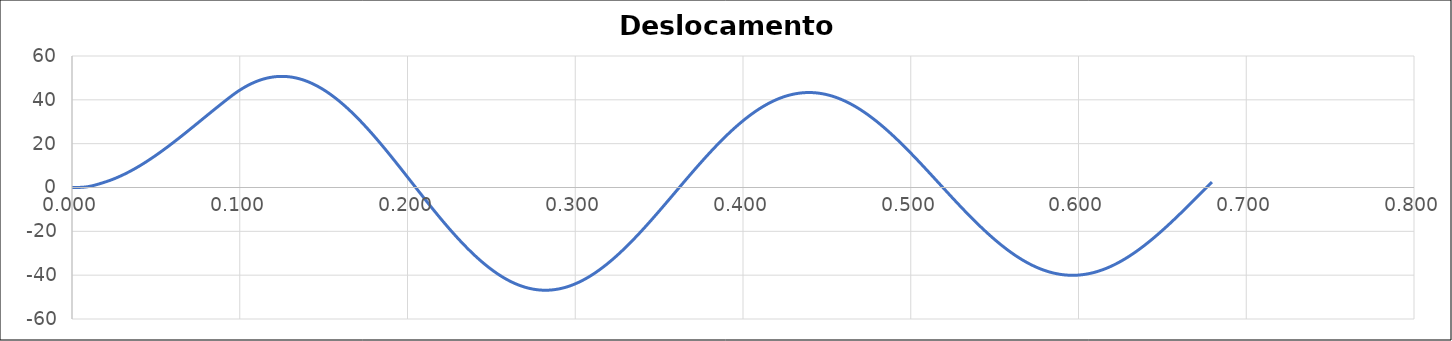
| Category | x em mm |
|---|---|
| 0.0 | 0 |
| 0.00031 | 0 |
| 0.00062 | 0 |
| 0.00093 | 0 |
| 0.00124 | 0.001 |
| 0.00155 | 0.002 |
| 0.0018599999999999999 | 0.003 |
| 0.00217 | 0.005 |
| 0.00248 | 0.007 |
| 0.00279 | 0.01 |
| 0.0031 | 0.013 |
| 0.00341 | 0.018 |
| 0.0037199999999999998 | 0.023 |
| 0.00403 | 0.03 |
| 0.00434 | 0.037 |
| 0.0046500000000000005 | 0.046 |
| 0.004960000000000001 | 0.055 |
| 0.005270000000000001 | 0.066 |
| 0.005580000000000002 | 0.079 |
| 0.005890000000000002 | 0.093 |
| 0.006200000000000002 | 0.108 |
| 0.006510000000000003 | 0.125 |
| 0.006820000000000003 | 0.144 |
| 0.0071300000000000035 | 0.165 |
| 0.007440000000000004 | 0.187 |
| 0.007750000000000004 | 0.212 |
| 0.008060000000000005 | 0.238 |
| 0.008370000000000004 | 0.267 |
| 0.008680000000000004 | 0.297 |
| 0.008990000000000003 | 0.33 |
| 0.009300000000000003 | 0.366 |
| 0.009610000000000002 | 0.403 |
| 0.009920000000000002 | 0.443 |
| 0.010230000000000001 | 0.486 |
| 0.01054 | 0.531 |
| 0.01085 | 0.578 |
| 0.01116 | 0.627 |
| 0.01147 | 0.678 |
| 0.011779999999999999 | 0.731 |
| 0.012089999999999998 | 0.786 |
| 0.012399999999999998 | 0.842 |
| 0.012709999999999997 | 0.901 |
| 0.013019999999999997 | 0.961 |
| 0.013329999999999996 | 1.022 |
| 0.013639999999999996 | 1.085 |
| 0.013949999999999995 | 1.149 |
| 0.014259999999999995 | 1.214 |
| 0.014569999999999994 | 1.281 |
| 0.014879999999999994 | 1.349 |
| 0.015189999999999993 | 1.417 |
| 0.015499999999999993 | 1.487 |
| 0.015809999999999994 | 1.558 |
| 0.016119999999999995 | 1.629 |
| 0.016429999999999997 | 1.701 |
| 0.016739999999999998 | 1.773 |
| 0.01705 | 1.846 |
| 0.01736 | 1.919 |
| 0.01767 | 1.993 |
| 0.017980000000000003 | 2.067 |
| 0.018290000000000004 | 2.141 |
| 0.018600000000000005 | 2.215 |
| 0.018910000000000007 | 2.289 |
| 0.019220000000000008 | 2.363 |
| 0.01953000000000001 | 2.438 |
| 0.01984000000000001 | 2.515 |
| 0.02015000000000001 | 2.592 |
| 0.020460000000000013 | 2.671 |
| 0.020770000000000014 | 2.75 |
| 0.021080000000000015 | 2.831 |
| 0.021390000000000017 | 2.913 |
| 0.021700000000000018 | 2.996 |
| 0.02201000000000002 | 3.08 |
| 0.02232000000000002 | 3.165 |
| 0.02263000000000002 | 3.252 |
| 0.022940000000000023 | 3.339 |
| 0.023250000000000024 | 3.428 |
| 0.023560000000000025 | 3.517 |
| 0.023870000000000027 | 3.608 |
| 0.024180000000000028 | 3.7 |
| 0.02449000000000003 | 3.793 |
| 0.02480000000000003 | 3.887 |
| 0.02511000000000003 | 3.982 |
| 0.025420000000000033 | 4.078 |
| 0.025730000000000034 | 4.175 |
| 0.026040000000000035 | 4.273 |
| 0.026350000000000037 | 4.372 |
| 0.026660000000000038 | 4.472 |
| 0.02697000000000004 | 4.574 |
| 0.02728000000000004 | 4.676 |
| 0.02759000000000004 | 4.78 |
| 0.027900000000000043 | 4.884 |
| 0.028210000000000044 | 4.989 |
| 0.028520000000000045 | 5.096 |
| 0.028830000000000047 | 5.203 |
| 0.029140000000000048 | 5.312 |
| 0.02945000000000005 | 5.422 |
| 0.02976000000000005 | 5.532 |
| 0.03007000000000005 | 5.644 |
| 0.030380000000000053 | 5.756 |
| 0.030690000000000054 | 5.87 |
| 0.031000000000000055 | 5.984 |
| 0.03131000000000005 | 6.1 |
| 0.03162000000000005 | 6.216 |
| 0.03193000000000005 | 6.334 |
| 0.032240000000000046 | 6.452 |
| 0.032550000000000044 | 6.572 |
| 0.03286000000000004 | 6.692 |
| 0.03317000000000004 | 6.813 |
| 0.03348000000000004 | 6.935 |
| 0.033790000000000035 | 7.059 |
| 0.03410000000000003 | 7.183 |
| 0.03441000000000003 | 7.308 |
| 0.03472000000000003 | 7.434 |
| 0.035030000000000026 | 7.561 |
| 0.035340000000000024 | 7.689 |
| 0.03565000000000002 | 7.817 |
| 0.03596000000000002 | 7.947 |
| 0.03627000000000002 | 8.078 |
| 0.036580000000000015 | 8.209 |
| 0.03689000000000001 | 8.341 |
| 0.03720000000000001 | 8.475 |
| 0.03751000000000001 | 8.609 |
| 0.037820000000000006 | 8.744 |
| 0.038130000000000004 | 8.88 |
| 0.03844 | 9.016 |
| 0.03875 | 9.154 |
| 0.03906 | 9.292 |
| 0.039369999999999995 | 9.432 |
| 0.03967999999999999 | 9.572 |
| 0.03998999999999999 | 9.713 |
| 0.04029999999999999 | 9.855 |
| 0.040609999999999986 | 9.997 |
| 0.040919999999999984 | 10.141 |
| 0.04122999999999998 | 10.285 |
| 0.04153999999999998 | 10.43 |
| 0.04184999999999998 | 10.576 |
| 0.042159999999999975 | 10.723 |
| 0.04246999999999997 | 10.87 |
| 0.04277999999999997 | 11.018 |
| 0.04308999999999997 | 11.167 |
| 0.043399999999999966 | 11.317 |
| 0.043709999999999964 | 11.468 |
| 0.04401999999999996 | 11.619 |
| 0.04432999999999996 | 11.771 |
| 0.04463999999999996 | 11.924 |
| 0.044949999999999955 | 12.078 |
| 0.04525999999999995 | 12.232 |
| 0.04556999999999995 | 12.387 |
| 0.04587999999999995 | 12.543 |
| 0.046189999999999946 | 12.699 |
| 0.046499999999999944 | 12.856 |
| 0.04680999999999994 | 13.014 |
| 0.04711999999999994 | 13.173 |
| 0.04742999999999994 | 13.332 |
| 0.047739999999999935 | 13.492 |
| 0.04804999999999993 | 13.653 |
| 0.04835999999999993 | 13.814 |
| 0.04866999999999993 | 13.976 |
| 0.048979999999999926 | 14.139 |
| 0.049289999999999924 | 14.302 |
| 0.04959999999999992 | 14.466 |
| 0.04990999999999992 | 14.631 |
| 0.05021999999999992 | 14.796 |
| 0.050529999999999915 | 14.962 |
| 0.05083999999999991 | 15.128 |
| 0.05114999999999991 | 15.295 |
| 0.05145999999999991 | 15.463 |
| 0.051769999999999906 | 15.632 |
| 0.052079999999999904 | 15.8 |
| 0.0523899999999999 | 15.97 |
| 0.0526999999999999 | 16.14 |
| 0.0530099999999999 | 16.311 |
| 0.053319999999999895 | 16.482 |
| 0.05362999999999989 | 16.654 |
| 0.05393999999999989 | 16.826 |
| 0.05424999999999989 | 16.999 |
| 0.054559999999999886 | 17.172 |
| 0.054869999999999884 | 17.346 |
| 0.05517999999999988 | 17.521 |
| 0.05548999999999988 | 17.696 |
| 0.05579999999999988 | 17.871 |
| 0.056109999999999875 | 18.048 |
| 0.05641999999999987 | 18.224 |
| 0.05672999999999987 | 18.401 |
| 0.05703999999999987 | 18.579 |
| 0.057349999999999866 | 18.757 |
| 0.057659999999999864 | 18.935 |
| 0.05796999999999986 | 19.114 |
| 0.05827999999999986 | 19.293 |
| 0.05858999999999986 | 19.473 |
| 0.058899999999999855 | 19.654 |
| 0.05920999999999985 | 19.834 |
| 0.05951999999999985 | 20.015 |
| 0.05982999999999985 | 20.197 |
| 0.060139999999999846 | 20.379 |
| 0.060449999999999844 | 20.561 |
| 0.06075999999999984 | 20.744 |
| 0.06106999999999984 | 20.927 |
| 0.06137999999999984 | 21.111 |
| 0.061689999999999835 | 21.295 |
| 0.06199999999999983 | 21.479 |
| 0.06230999999999983 | 21.664 |
| 0.06261999999999983 | 21.849 |
| 0.06292999999999983 | 22.035 |
| 0.06323999999999984 | 22.22 |
| 0.06354999999999984 | 22.406 |
| 0.06385999999999985 | 22.593 |
| 0.06416999999999985 | 22.78 |
| 0.06447999999999986 | 22.967 |
| 0.06478999999999986 | 23.154 |
| 0.06509999999999987 | 23.342 |
| 0.06540999999999987 | 23.53 |
| 0.06571999999999988 | 23.718 |
| 0.06602999999999988 | 23.907 |
| 0.06633999999999989 | 24.095 |
| 0.06664999999999989 | 24.284 |
| 0.0669599999999999 | 24.474 |
| 0.0672699999999999 | 24.663 |
| 0.0675799999999999 | 24.853 |
| 0.06788999999999991 | 25.043 |
| 0.06819999999999991 | 25.234 |
| 0.06850999999999992 | 25.424 |
| 0.06881999999999992 | 25.615 |
| 0.06912999999999993 | 25.806 |
| 0.06943999999999993 | 25.997 |
| 0.06974999999999994 | 26.188 |
| 0.07005999999999994 | 26.38 |
| 0.07036999999999995 | 26.571 |
| 0.07067999999999995 | 26.763 |
| 0.07098999999999996 | 26.955 |
| 0.07129999999999996 | 27.147 |
| 0.07160999999999997 | 27.339 |
| 0.07191999999999997 | 27.532 |
| 0.07222999999999997 | 27.724 |
| 0.07253999999999998 | 27.917 |
| 0.07284999999999998 | 28.11 |
| 0.07315999999999999 | 28.303 |
| 0.07347 | 28.496 |
| 0.07378 | 28.689 |
| 0.07409 | 28.882 |
| 0.07440000000000001 | 29.075 |
| 0.07471000000000001 | 29.269 |
| 0.07502000000000002 | 29.462 |
| 0.07533000000000002 | 29.656 |
| 0.07564000000000003 | 29.849 |
| 0.07595000000000003 | 30.043 |
| 0.07626000000000004 | 30.236 |
| 0.07657000000000004 | 30.43 |
| 0.07688000000000005 | 30.623 |
| 0.07719000000000005 | 30.817 |
| 0.07750000000000005 | 31.011 |
| 0.07781000000000006 | 31.204 |
| 0.07812000000000006 | 31.398 |
| 0.07843000000000007 | 31.592 |
| 0.07874000000000007 | 31.785 |
| 0.07905000000000008 | 31.979 |
| 0.07936000000000008 | 32.172 |
| 0.07967000000000009 | 32.366 |
| 0.07998000000000009 | 32.559 |
| 0.0802900000000001 | 32.752 |
| 0.0806000000000001 | 32.946 |
| 0.0809100000000001 | 33.139 |
| 0.08122000000000011 | 33.332 |
| 0.08153000000000012 | 33.525 |
| 0.08184000000000012 | 33.718 |
| 0.08215000000000013 | 33.911 |
| 0.08246000000000013 | 34.103 |
| 0.08277000000000014 | 34.296 |
| 0.08308000000000014 | 34.488 |
| 0.08339000000000014 | 34.681 |
| 0.08370000000000015 | 34.873 |
| 0.08401000000000015 | 35.065 |
| 0.08432000000000016 | 35.257 |
| 0.08463000000000016 | 35.448 |
| 0.08494000000000017 | 35.64 |
| 0.08525000000000017 | 35.831 |
| 0.08556000000000018 | 36.022 |
| 0.08587000000000018 | 36.213 |
| 0.08618000000000019 | 36.404 |
| 0.08649000000000019 | 36.595 |
| 0.0868000000000002 | 36.785 |
| 0.0871100000000002 | 36.975 |
| 0.0874200000000002 | 37.165 |
| 0.08773000000000021 | 37.355 |
| 0.08804000000000022 | 37.544 |
| 0.08835000000000022 | 37.733 |
| 0.08866000000000022 | 37.922 |
| 0.08897000000000023 | 38.11 |
| 0.08928000000000023 | 38.299 |
| 0.08959000000000024 | 38.487 |
| 0.08990000000000024 | 38.675 |
| 0.09021000000000025 | 38.862 |
| 0.09052000000000025 | 39.049 |
| 0.09083000000000026 | 39.236 |
| 0.09114000000000026 | 39.423 |
| 0.09145000000000027 | 39.609 |
| 0.09176000000000027 | 39.795 |
| 0.09207000000000028 | 39.98 |
| 0.09238000000000028 | 40.165 |
| 0.09269000000000029 | 40.35 |
| 0.09300000000000029 | 40.535 |
| 0.0933100000000003 | 40.719 |
| 0.0936200000000003 | 40.902 |
| 0.0939300000000003 | 41.086 |
| 0.09424000000000031 | 41.269 |
| 0.09455000000000031 | 41.451 |
| 0.09486000000000032 | 41.633 |
| 0.09517000000000032 | 41.814 |
| 0.09548000000000033 | 41.993 |
| 0.09579000000000033 | 42.17 |
| 0.09610000000000034 | 42.346 |
| 0.09641000000000034 | 42.519 |
| 0.09672000000000035 | 42.691 |
| 0.09703000000000035 | 42.862 |
| 0.09734000000000036 | 43.031 |
| 0.09765000000000036 | 43.198 |
| 0.09796000000000037 | 43.363 |
| 0.09827000000000037 | 43.527 |
| 0.09858000000000038 | 43.688 |
| 0.09889000000000038 | 43.849 |
| 0.09920000000000039 | 44.007 |
| 0.09951000000000039 | 44.164 |
| 0.0998200000000004 | 44.319 |
| 0.1001300000000004 | 44.472 |
| 0.1004400000000004 | 44.623 |
| 0.10075000000000041 | 44.773 |
| 0.10106000000000041 | 44.921 |
| 0.10137000000000042 | 45.067 |
| 0.10168000000000042 | 45.211 |
| 0.10199000000000043 | 45.354 |
| 0.10230000000000043 | 45.495 |
| 0.10261000000000044 | 45.634 |
| 0.10292000000000044 | 45.771 |
| 0.10323000000000045 | 45.906 |
| 0.10354000000000045 | 46.04 |
| 0.10385000000000046 | 46.171 |
| 0.10416000000000046 | 46.301 |
| 0.10447000000000047 | 46.43 |
| 0.10478000000000047 | 46.556 |
| 0.10509000000000047 | 46.68 |
| 0.10540000000000048 | 46.803 |
| 0.10571000000000048 | 46.924 |
| 0.10602000000000049 | 47.043 |
| 0.1063300000000005 | 47.16 |
| 0.1066400000000005 | 47.275 |
| 0.1069500000000005 | 47.388 |
| 0.10726000000000051 | 47.5 |
| 0.10757000000000051 | 47.61 |
| 0.10788000000000052 | 47.718 |
| 0.10819000000000052 | 47.824 |
| 0.10850000000000053 | 47.928 |
| 0.10881000000000053 | 48.03 |
| 0.10912000000000054 | 48.13 |
| 0.10943000000000054 | 48.229 |
| 0.10974000000000055 | 48.325 |
| 0.11005000000000055 | 48.42 |
| 0.11036000000000055 | 48.513 |
| 0.11067000000000056 | 48.604 |
| 0.11098000000000056 | 48.693 |
| 0.11129000000000057 | 48.78 |
| 0.11160000000000057 | 48.865 |
| 0.11191000000000058 | 48.948 |
| 0.11222000000000058 | 49.03 |
| 0.11253000000000059 | 49.109 |
| 0.11284000000000059 | 49.187 |
| 0.1131500000000006 | 49.262 |
| 0.1134600000000006 | 49.336 |
| 0.1137700000000006 | 49.408 |
| 0.11408000000000061 | 49.478 |
| 0.11439000000000062 | 49.546 |
| 0.11470000000000062 | 49.612 |
| 0.11501000000000063 | 49.676 |
| 0.11532000000000063 | 49.738 |
| 0.11563000000000064 | 49.799 |
| 0.11594000000000064 | 49.857 |
| 0.11625000000000064 | 49.913 |
| 0.11656000000000065 | 49.968 |
| 0.11687000000000065 | 50.02 |
| 0.11718000000000066 | 50.071 |
| 0.11749000000000066 | 50.12 |
| 0.11780000000000067 | 50.166 |
| 0.11811000000000067 | 50.211 |
| 0.11842000000000068 | 50.254 |
| 0.11873000000000068 | 50.295 |
| 0.11904000000000069 | 50.334 |
| 0.11935000000000069 | 50.371 |
| 0.1196600000000007 | 50.406 |
| 0.1199700000000007 | 50.439 |
| 0.1202800000000007 | 50.47 |
| 0.12059000000000071 | 50.499 |
| 0.12090000000000072 | 50.526 |
| 0.12121000000000072 | 50.552 |
| 0.12152000000000072 | 50.575 |
| 0.12183000000000073 | 50.596 |
| 0.12214000000000073 | 50.616 |
| 0.12245000000000074 | 50.633 |
| 0.12276000000000074 | 50.649 |
| 0.12307000000000075 | 50.663 |
| 0.12338000000000075 | 50.674 |
| 0.12369000000000076 | 50.684 |
| 0.12400000000000076 | 50.692 |
| 0.12431000000000077 | 50.697 |
| 0.12462000000000077 | 50.701 |
| 0.12493000000000078 | 50.703 |
| 0.12524000000000077 | 50.703 |
| 0.12555000000000077 | 50.701 |
| 0.12586000000000078 | 50.697 |
| 0.12617000000000078 | 50.691 |
| 0.1264800000000008 | 50.683 |
| 0.1267900000000008 | 50.673 |
| 0.1271000000000008 | 50.662 |
| 0.1274100000000008 | 50.648 |
| 0.1277200000000008 | 50.632 |
| 0.1280300000000008 | 50.615 |
| 0.12834000000000081 | 50.595 |
| 0.12865000000000082 | 50.574 |
| 0.12896000000000082 | 50.55 |
| 0.12927000000000083 | 50.525 |
| 0.12958000000000083 | 50.498 |
| 0.12989000000000084 | 50.469 |
| 0.13020000000000084 | 50.438 |
| 0.13051000000000085 | 50.405 |
| 0.13082000000000085 | 50.37 |
| 0.13113000000000086 | 50.333 |
| 0.13144000000000086 | 50.294 |
| 0.13175000000000087 | 50.253 |
| 0.13206000000000087 | 50.21 |
| 0.13237000000000088 | 50.166 |
| 0.13268000000000088 | 50.119 |
| 0.13299000000000089 | 50.071 |
| 0.1333000000000009 | 50.021 |
| 0.1336100000000009 | 49.968 |
| 0.1339200000000009 | 49.914 |
| 0.1342300000000009 | 49.858 |
| 0.1345400000000009 | 49.8 |
| 0.1348500000000009 | 49.74 |
| 0.13516000000000092 | 49.679 |
| 0.13547000000000092 | 49.615 |
| 0.13578000000000093 | 49.55 |
| 0.13609000000000093 | 49.482 |
| 0.13640000000000094 | 49.413 |
| 0.13671000000000094 | 49.342 |
| 0.13702000000000095 | 49.269 |
| 0.13733000000000095 | 49.194 |
| 0.13764000000000096 | 49.117 |
| 0.13795000000000096 | 49.039 |
| 0.13826000000000097 | 48.958 |
| 0.13857000000000097 | 48.876 |
| 0.13888000000000097 | 48.792 |
| 0.13919000000000098 | 48.706 |
| 0.13950000000000098 | 48.618 |
| 0.139810000000001 | 48.528 |
| 0.140120000000001 | 48.436 |
| 0.140430000000001 | 48.343 |
| 0.140740000000001 | 48.248 |
| 0.141050000000001 | 48.151 |
| 0.141360000000001 | 48.052 |
| 0.14167000000000102 | 47.951 |
| 0.14198000000000102 | 47.849 |
| 0.14229000000000103 | 47.744 |
| 0.14260000000000103 | 47.638 |
| 0.14291000000000104 | 47.53 |
| 0.14322000000000104 | 47.421 |
| 0.14353000000000105 | 47.309 |
| 0.14384000000000105 | 47.196 |
| 0.14415000000000106 | 47.081 |
| 0.14446000000000106 | 46.964 |
| 0.14477000000000106 | 46.845 |
| 0.14508000000000107 | 46.725 |
| 0.14539000000000107 | 46.603 |
| 0.14570000000000108 | 46.479 |
| 0.14601000000000108 | 46.354 |
| 0.1463200000000011 | 46.226 |
| 0.1466300000000011 | 46.097 |
| 0.1469400000000011 | 45.966 |
| 0.1472500000000011 | 45.834 |
| 0.1475600000000011 | 45.699 |
| 0.1478700000000011 | 45.563 |
| 0.14818000000000112 | 45.426 |
| 0.14849000000000112 | 45.286 |
| 0.14880000000000113 | 45.145 |
| 0.14911000000000113 | 45.002 |
| 0.14942000000000114 | 44.858 |
| 0.14973000000000114 | 44.712 |
| 0.15004000000000114 | 44.564 |
| 0.15035000000000115 | 44.415 |
| 0.15066000000000115 | 44.263 |
| 0.15097000000000116 | 44.111 |
| 0.15128000000000116 | 43.956 |
| 0.15159000000000117 | 43.8 |
| 0.15190000000000117 | 43.642 |
| 0.15221000000000118 | 43.483 |
| 0.15252000000000118 | 43.322 |
| 0.1528300000000012 | 43.159 |
| 0.1531400000000012 | 42.995 |
| 0.1534500000000012 | 42.829 |
| 0.1537600000000012 | 42.662 |
| 0.1540700000000012 | 42.493 |
| 0.1543800000000012 | 42.322 |
| 0.15469000000000122 | 42.15 |
| 0.15500000000000122 | 41.977 |
| 0.15531000000000122 | 41.801 |
| 0.15562000000000123 | 41.624 |
| 0.15593000000000123 | 41.446 |
| 0.15624000000000124 | 41.266 |
| 0.15655000000000124 | 41.085 |
| 0.15686000000000125 | 40.902 |
| 0.15717000000000125 | 40.717 |
| 0.15748000000000126 | 40.531 |
| 0.15779000000000126 | 40.344 |
| 0.15810000000000127 | 40.155 |
| 0.15841000000000127 | 39.964 |
| 0.15872000000000128 | 39.772 |
| 0.15903000000000128 | 39.579 |
| 0.1593400000000013 | 39.384 |
| 0.1596500000000013 | 39.188 |
| 0.1599600000000013 | 38.99 |
| 0.1602700000000013 | 38.791 |
| 0.1605800000000013 | 38.59 |
| 0.1608900000000013 | 38.388 |
| 0.16120000000000131 | 38.185 |
| 0.16151000000000132 | 37.98 |
| 0.16182000000000132 | 37.774 |
| 0.16213000000000133 | 37.566 |
| 0.16244000000000133 | 37.357 |
| 0.16275000000000134 | 37.147 |
| 0.16306000000000134 | 36.935 |
| 0.16337000000000135 | 36.722 |
| 0.16368000000000135 | 36.507 |
| 0.16399000000000136 | 36.291 |
| 0.16430000000000136 | 36.074 |
| 0.16461000000000137 | 35.856 |
| 0.16492000000000137 | 35.636 |
| 0.16523000000000138 | 35.415 |
| 0.16554000000000138 | 35.193 |
| 0.16585000000000139 | 34.969 |
| 0.1661600000000014 | 34.744 |
| 0.1664700000000014 | 34.518 |
| 0.1667800000000014 | 34.291 |
| 0.1670900000000014 | 34.062 |
| 0.1674000000000014 | 33.832 |
| 0.1677100000000014 | 33.601 |
| 0.16802000000000142 | 33.368 |
| 0.16833000000000142 | 33.135 |
| 0.16864000000000143 | 32.9 |
| 0.16895000000000143 | 32.664 |
| 0.16926000000000144 | 32.427 |
| 0.16957000000000144 | 32.189 |
| 0.16988000000000145 | 31.949 |
| 0.17019000000000145 | 31.708 |
| 0.17050000000000146 | 31.467 |
| 0.17081000000000146 | 31.224 |
| 0.17112000000000147 | 30.98 |
| 0.17143000000000147 | 30.735 |
| 0.17174000000000147 | 30.488 |
| 0.17205000000000148 | 30.241 |
| 0.17236000000000148 | 29.992 |
| 0.1726700000000015 | 29.743 |
| 0.1729800000000015 | 29.492 |
| 0.1732900000000015 | 29.241 |
| 0.1736000000000015 | 28.988 |
| 0.1739100000000015 | 28.734 |
| 0.1742200000000015 | 28.48 |
| 0.17453000000000152 | 28.224 |
| 0.17484000000000152 | 27.967 |
| 0.17515000000000153 | 27.709 |
| 0.17546000000000153 | 27.45 |
| 0.17577000000000154 | 27.191 |
| 0.17608000000000154 | 26.93 |
| 0.17639000000000155 | 26.668 |
| 0.17670000000000155 | 26.406 |
| 0.17701000000000155 | 26.142 |
| 0.17732000000000156 | 25.878 |
| 0.17763000000000156 | 25.612 |
| 0.17794000000000157 | 25.346 |
| 0.17825000000000157 | 25.079 |
| 0.17856000000000158 | 24.811 |
| 0.17887000000000158 | 24.542 |
| 0.1791800000000016 | 24.272 |
| 0.1794900000000016 | 24.002 |
| 0.1798000000000016 | 23.73 |
| 0.1801100000000016 | 23.458 |
| 0.1804200000000016 | 23.185 |
| 0.1807300000000016 | 22.911 |
| 0.18104000000000162 | 22.636 |
| 0.18135000000000162 | 22.361 |
| 0.18166000000000163 | 22.085 |
| 0.18197000000000163 | 21.808 |
| 0.18228000000000164 | 21.53 |
| 0.18259000000000164 | 21.251 |
| 0.18290000000000164 | 20.972 |
| 0.18321000000000165 | 20.692 |
| 0.18352000000000165 | 20.411 |
| 0.18383000000000166 | 20.13 |
| 0.18414000000000166 | 19.848 |
| 0.18445000000000167 | 19.565 |
| 0.18476000000000167 | 19.282 |
| 0.18507000000000168 | 18.998 |
| 0.18538000000000168 | 18.713 |
| 0.1856900000000017 | 18.428 |
| 0.1860000000000017 | 18.142 |
| 0.1863100000000017 | 17.855 |
| 0.1866200000000017 | 17.568 |
| 0.1869300000000017 | 17.28 |
| 0.1872400000000017 | 16.992 |
| 0.18755000000000172 | 16.703 |
| 0.18786000000000172 | 16.414 |
| 0.18817000000000172 | 16.124 |
| 0.18848000000000173 | 15.833 |
| 0.18879000000000173 | 15.542 |
| 0.18910000000000174 | 15.251 |
| 0.18941000000000174 | 14.959 |
| 0.18972000000000175 | 14.666 |
| 0.19003000000000175 | 14.373 |
| 0.19034000000000176 | 14.08 |
| 0.19065000000000176 | 13.786 |
| 0.19096000000000177 | 13.492 |
| 0.19127000000000177 | 13.197 |
| 0.19158000000000178 | 12.902 |
| 0.19189000000000178 | 12.606 |
| 0.19220000000000179 | 12.31 |
| 0.1925100000000018 | 12.014 |
| 0.1928200000000018 | 11.717 |
| 0.1931300000000018 | 11.42 |
| 0.1934400000000018 | 11.122 |
| 0.1937500000000018 | 10.825 |
| 0.19406000000000181 | 10.527 |
| 0.19437000000000182 | 10.228 |
| 0.19468000000000182 | 9.93 |
| 0.19499000000000183 | 9.631 |
| 0.19530000000000183 | 9.331 |
| 0.19561000000000184 | 9.032 |
| 0.19592000000000184 | 8.732 |
| 0.19623000000000185 | 8.432 |
| 0.19654000000000185 | 8.132 |
| 0.19685000000000186 | 7.831 |
| 0.19716000000000186 | 7.531 |
| 0.19747000000000187 | 7.23 |
| 0.19778000000000187 | 6.929 |
| 0.19809000000000188 | 6.627 |
| 0.19840000000000188 | 6.326 |
| 0.19871000000000189 | 6.024 |
| 0.1990200000000019 | 5.723 |
| 0.1993300000000019 | 5.421 |
| 0.1996400000000019 | 5.119 |
| 0.1999500000000019 | 4.817 |
| 0.2002600000000019 | 4.515 |
| 0.2005700000000019 | 4.213 |
| 0.20088000000000192 | 3.91 |
| 0.20119000000000192 | 3.608 |
| 0.20150000000000193 | 3.306 |
| 0.20181000000000193 | 3.003 |
| 0.20212000000000194 | 2.701 |
| 0.20243000000000194 | 2.398 |
| 0.20274000000000195 | 2.096 |
| 0.20305000000000195 | 1.793 |
| 0.20336000000000196 | 1.491 |
| 0.20367000000000196 | 1.189 |
| 0.20398000000000197 | 0.886 |
| 0.20429000000000197 | 0.584 |
| 0.20460000000000197 | 0.282 |
| 0.20491000000000198 | -0.02 |
| 0.20522000000000198 | -0.322 |
| 0.205530000000002 | -0.624 |
| 0.205840000000002 | -0.926 |
| 0.206150000000002 | -1.227 |
| 0.206460000000002 | -1.529 |
| 0.206770000000002 | -1.83 |
| 0.207080000000002 | -2.132 |
| 0.20739000000000202 | -2.433 |
| 0.20770000000000202 | -2.733 |
| 0.20801000000000203 | -3.034 |
| 0.20832000000000203 | -3.334 |
| 0.20863000000000204 | -3.635 |
| 0.20894000000000204 | -3.935 |
| 0.20925000000000205 | -4.234 |
| 0.20956000000000205 | -4.534 |
| 0.20987000000000205 | -4.833 |
| 0.21018000000000206 | -5.132 |
| 0.21049000000000206 | -5.431 |
| 0.21080000000000207 | -5.729 |
| 0.21111000000000207 | -6.027 |
| 0.21142000000000208 | -6.325 |
| 0.21173000000000208 | -6.622 |
| 0.2120400000000021 | -6.919 |
| 0.2123500000000021 | -7.216 |
| 0.2126600000000021 | -7.512 |
| 0.2129700000000021 | -7.808 |
| 0.2132800000000021 | -8.103 |
| 0.2135900000000021 | -8.399 |
| 0.21390000000000212 | -8.693 |
| 0.21421000000000212 | -8.988 |
| 0.21452000000000213 | -9.281 |
| 0.21483000000000213 | -9.575 |
| 0.21514000000000214 | -9.868 |
| 0.21545000000000214 | -10.16 |
| 0.21576000000000214 | -10.452 |
| 0.21607000000000215 | -10.744 |
| 0.21638000000000215 | -11.035 |
| 0.21669000000000216 | -11.325 |
| 0.21700000000000216 | -11.615 |
| 0.21731000000000217 | -11.904 |
| 0.21762000000000217 | -12.193 |
| 0.21793000000000218 | -12.482 |
| 0.21824000000000218 | -12.769 |
| 0.2185500000000022 | -13.056 |
| 0.2188600000000022 | -13.343 |
| 0.2191700000000022 | -13.629 |
| 0.2194800000000022 | -13.914 |
| 0.2197900000000022 | -14.199 |
| 0.2201000000000022 | -14.483 |
| 0.22041000000000222 | -14.767 |
| 0.22072000000000222 | -15.049 |
| 0.22103000000000222 | -15.332 |
| 0.22134000000000223 | -15.613 |
| 0.22165000000000223 | -15.894 |
| 0.22196000000000224 | -16.174 |
| 0.22227000000000224 | -16.453 |
| 0.22258000000000225 | -16.732 |
| 0.22289000000000225 | -17.01 |
| 0.22320000000000226 | -17.287 |
| 0.22351000000000226 | -17.563 |
| 0.22382000000000227 | -17.839 |
| 0.22413000000000227 | -18.114 |
| 0.22444000000000228 | -18.388 |
| 0.22475000000000228 | -18.661 |
| 0.22506000000000229 | -18.934 |
| 0.2253700000000023 | -19.205 |
| 0.2256800000000023 | -19.476 |
| 0.2259900000000023 | -19.746 |
| 0.2263000000000023 | -20.016 |
| 0.2266100000000023 | -20.284 |
| 0.22692000000000231 | -20.551 |
| 0.22723000000000232 | -20.818 |
| 0.22754000000000232 | -21.084 |
| 0.22785000000000233 | -21.349 |
| 0.22816000000000233 | -21.613 |
| 0.22847000000000234 | -21.876 |
| 0.22878000000000234 | -22.138 |
| 0.22909000000000235 | -22.399 |
| 0.22940000000000235 | -22.659 |
| 0.22971000000000236 | -22.918 |
| 0.23002000000000236 | -23.177 |
| 0.23033000000000237 | -23.434 |
| 0.23064000000000237 | -23.69 |
| 0.23095000000000238 | -23.946 |
| 0.23126000000000238 | -24.2 |
| 0.23157000000000239 | -24.453 |
| 0.2318800000000024 | -24.706 |
| 0.2321900000000024 | -24.957 |
| 0.2325000000000024 | -25.207 |
| 0.2328100000000024 | -25.457 |
| 0.2331200000000024 | -25.705 |
| 0.2334300000000024 | -25.952 |
| 0.23374000000000242 | -26.198 |
| 0.23405000000000242 | -26.443 |
| 0.23436000000000243 | -26.687 |
| 0.23467000000000243 | -26.93 |
| 0.23498000000000244 | -27.171 |
| 0.23529000000000244 | -27.412 |
| 0.23560000000000245 | -27.651 |
| 0.23591000000000245 | -27.889 |
| 0.23622000000000246 | -28.127 |
| 0.23653000000000246 | -28.363 |
| 0.23684000000000247 | -28.597 |
| 0.23715000000000247 | -28.831 |
| 0.23746000000000247 | -29.063 |
| 0.23777000000000248 | -29.295 |
| 0.23808000000000248 | -29.525 |
| 0.2383900000000025 | -29.754 |
| 0.2387000000000025 | -29.981 |
| 0.2390100000000025 | -30.208 |
| 0.2393200000000025 | -30.433 |
| 0.2396300000000025 | -30.657 |
| 0.2399400000000025 | -30.88 |
| 0.24025000000000252 | -31.101 |
| 0.24056000000000252 | -31.321 |
| 0.24087000000000253 | -31.54 |
| 0.24118000000000253 | -31.758 |
| 0.24149000000000254 | -31.974 |
| 0.24180000000000254 | -32.189 |
| 0.24211000000000255 | -32.403 |
| 0.24242000000000255 | -32.615 |
| 0.24273000000000255 | -32.826 |
| 0.24304000000000256 | -33.036 |
| 0.24335000000000256 | -33.245 |
| 0.24366000000000257 | -33.452 |
| 0.24397000000000257 | -33.658 |
| 0.24428000000000258 | -33.862 |
| 0.24459000000000258 | -34.065 |
| 0.2449000000000026 | -34.267 |
| 0.2452100000000026 | -34.467 |
| 0.2455200000000026 | -34.666 |
| 0.2458300000000026 | -34.863 |
| 0.2461400000000026 | -35.059 |
| 0.2464500000000026 | -35.254 |
| 0.24676000000000262 | -35.447 |
| 0.24707000000000262 | -35.639 |
| 0.24738000000000263 | -35.83 |
| 0.24769000000000263 | -36.019 |
| 0.24800000000000264 | -36.206 |
| 0.24831000000000264 | -36.392 |
| 0.24862000000000264 | -36.577 |
| 0.24893000000000265 | -36.76 |
| 0.24924000000000265 | -36.942 |
| 0.24955000000000266 | -37.122 |
| 0.24986000000000266 | -37.301 |
| 0.25017000000000267 | -37.478 |
| 0.25048000000000264 | -37.654 |
| 0.2507900000000026 | -37.828 |
| 0.2511000000000026 | -38.001 |
| 0.2514100000000026 | -38.172 |
| 0.25172000000000255 | -38.342 |
| 0.25203000000000253 | -38.51 |
| 0.2523400000000025 | -38.677 |
| 0.2526500000000025 | -38.842 |
| 0.25296000000000246 | -39.005 |
| 0.25327000000000244 | -39.167 |
| 0.2535800000000024 | -39.328 |
| 0.2538900000000024 | -39.487 |
| 0.25420000000000237 | -39.644 |
| 0.25451000000000235 | -39.8 |
| 0.2548200000000023 | -39.954 |
| 0.2551300000000023 | -40.107 |
| 0.2554400000000023 | -40.258 |
| 0.25575000000000225 | -40.407 |
| 0.25606000000000223 | -40.555 |
| 0.2563700000000022 | -40.701 |
| 0.2566800000000022 | -40.846 |
| 0.25699000000000216 | -40.989 |
| 0.25730000000000214 | -41.13 |
| 0.2576100000000021 | -41.27 |
| 0.2579200000000021 | -41.408 |
| 0.25823000000000207 | -41.545 |
| 0.25854000000000205 | -41.68 |
| 0.258850000000002 | -41.813 |
| 0.259160000000002 | -41.944 |
| 0.259470000000002 | -42.074 |
| 0.25978000000000195 | -42.203 |
| 0.26009000000000193 | -42.329 |
| 0.2604000000000019 | -42.454 |
| 0.2607100000000019 | -42.577 |
| 0.26102000000000186 | -42.699 |
| 0.26133000000000184 | -42.819 |
| 0.2616400000000018 | -42.937 |
| 0.2619500000000018 | -43.054 |
| 0.26226000000000177 | -43.168 |
| 0.26257000000000175 | -43.282 |
| 0.2628800000000017 | -43.393 |
| 0.2631900000000017 | -43.503 |
| 0.2635000000000017 | -43.611 |
| 0.26381000000000165 | -43.717 |
| 0.26412000000000163 | -43.822 |
| 0.2644300000000016 | -43.925 |
| 0.2647400000000016 | -44.026 |
| 0.26505000000000156 | -44.125 |
| 0.26536000000000154 | -44.223 |
| 0.2656700000000015 | -44.319 |
| 0.2659800000000015 | -44.413 |
| 0.26629000000000147 | -44.506 |
| 0.26660000000000145 | -44.597 |
| 0.2669100000000014 | -44.686 |
| 0.2672200000000014 | -44.773 |
| 0.2675300000000014 | -44.859 |
| 0.26784000000000135 | -44.942 |
| 0.26815000000000133 | -45.024 |
| 0.2684600000000013 | -45.105 |
| 0.2687700000000013 | -45.183 |
| 0.26908000000000126 | -45.26 |
| 0.26939000000000124 | -45.335 |
| 0.2697000000000012 | -45.408 |
| 0.2700100000000012 | -45.48 |
| 0.27032000000000117 | -45.549 |
| 0.27063000000000115 | -45.617 |
| 0.2709400000000011 | -45.684 |
| 0.2712500000000011 | -45.748 |
| 0.2715600000000011 | -45.811 |
| 0.27187000000000106 | -45.871 |
| 0.27218000000000103 | -45.93 |
| 0.272490000000001 | -45.988 |
| 0.272800000000001 | -46.043 |
| 0.27311000000000096 | -46.097 |
| 0.27342000000000094 | -46.149 |
| 0.2737300000000009 | -46.199 |
| 0.2740400000000009 | -46.247 |
| 0.27435000000000087 | -46.294 |
| 0.27466000000000085 | -46.339 |
| 0.2749700000000008 | -46.381 |
| 0.2752800000000008 | -46.423 |
| 0.2755900000000008 | -46.462 |
| 0.27590000000000076 | -46.5 |
| 0.27621000000000073 | -46.535 |
| 0.2765200000000007 | -46.569 |
| 0.2768300000000007 | -46.601 |
| 0.27714000000000066 | -46.632 |
| 0.27745000000000064 | -46.66 |
| 0.2777600000000006 | -46.687 |
| 0.2780700000000006 | -46.712 |
| 0.27838000000000057 | -46.735 |
| 0.27869000000000055 | -46.756 |
| 0.2790000000000005 | -46.776 |
| 0.2793100000000005 | -46.794 |
| 0.2796200000000005 | -46.81 |
| 0.27993000000000046 | -46.824 |
| 0.28024000000000043 | -46.836 |
| 0.2805500000000004 | -46.847 |
| 0.2808600000000004 | -46.855 |
| 0.28117000000000036 | -46.862 |
| 0.28148000000000034 | -46.867 |
| 0.2817900000000003 | -46.871 |
| 0.2821000000000003 | -46.872 |
| 0.28241000000000027 | -46.872 |
| 0.28272000000000025 | -46.87 |
| 0.2830300000000002 | -46.866 |
| 0.2833400000000002 | -46.86 |
| 0.2836500000000002 | -46.853 |
| 0.28396000000000016 | -46.843 |
| 0.28427000000000013 | -46.832 |
| 0.2845800000000001 | -46.819 |
| 0.2848900000000001 | -46.805 |
| 0.28520000000000006 | -46.788 |
| 0.28551000000000004 | -46.77 |
| 0.28582 | -46.75 |
| 0.28613 | -46.728 |
| 0.28644 | -46.704 |
| 0.28674999999999995 | -46.679 |
| 0.2870599999999999 | -46.652 |
| 0.2873699999999999 | -46.623 |
| 0.2876799999999999 | -46.592 |
| 0.28798999999999986 | -46.559 |
| 0.28829999999999983 | -46.525 |
| 0.2886099999999998 | -46.489 |
| 0.2889199999999998 | -46.451 |
| 0.28922999999999977 | -46.411 |
| 0.28953999999999974 | -46.37 |
| 0.2898499999999997 | -46.327 |
| 0.2901599999999997 | -46.282 |
| 0.2904699999999997 | -46.235 |
| 0.29077999999999965 | -46.186 |
| 0.2910899999999996 | -46.136 |
| 0.2913999999999996 | -46.084 |
| 0.2917099999999996 | -46.03 |
| 0.29201999999999956 | -45.975 |
| 0.29232999999999953 | -45.917 |
| 0.2926399999999995 | -45.858 |
| 0.2929499999999995 | -45.798 |
| 0.29325999999999947 | -45.735 |
| 0.29356999999999944 | -45.671 |
| 0.2938799999999994 | -45.605 |
| 0.2941899999999994 | -45.537 |
| 0.2944999999999994 | -45.468 |
| 0.29480999999999935 | -45.396 |
| 0.2951199999999993 | -45.324 |
| 0.2954299999999993 | -45.249 |
| 0.2957399999999993 | -45.173 |
| 0.29604999999999926 | -45.095 |
| 0.29635999999999924 | -45.015 |
| 0.2966699999999992 | -44.933 |
| 0.2969799999999992 | -44.85 |
| 0.29728999999999917 | -44.765 |
| 0.29759999999999914 | -44.679 |
| 0.2979099999999991 | -44.59 |
| 0.2982199999999991 | -44.501 |
| 0.2985299999999991 | -44.409 |
| 0.29883999999999905 | -44.316 |
| 0.29914999999999903 | -44.221 |
| 0.299459999999999 | -44.124 |
| 0.299769999999999 | -44.026 |
| 0.30007999999999896 | -43.926 |
| 0.30038999999999894 | -43.824 |
| 0.3006999999999989 | -43.721 |
| 0.3010099999999989 | -43.616 |
| 0.30131999999999887 | -43.509 |
| 0.30162999999999884 | -43.401 |
| 0.3019399999999988 | -43.291 |
| 0.3022499999999988 | -43.18 |
| 0.3025599999999988 | -43.067 |
| 0.30286999999999875 | -42.952 |
| 0.30317999999999873 | -42.836 |
| 0.3034899999999987 | -42.718 |
| 0.3037999999999987 | -42.598 |
| 0.30410999999999866 | -42.477 |
| 0.30441999999999864 | -42.354 |
| 0.3047299999999986 | -42.23 |
| 0.3050399999999986 | -42.104 |
| 0.30534999999999857 | -41.976 |
| 0.30565999999999854 | -41.847 |
| 0.3059699999999985 | -41.717 |
| 0.3062799999999985 | -41.585 |
| 0.3065899999999985 | -41.451 |
| 0.30689999999999845 | -41.315 |
| 0.30720999999999843 | -41.179 |
| 0.3075199999999984 | -41.04 |
| 0.3078299999999984 | -40.9 |
| 0.30813999999999836 | -40.759 |
| 0.30844999999999834 | -40.616 |
| 0.3087599999999983 | -40.471 |
| 0.3090699999999983 | -40.325 |
| 0.30937999999999827 | -40.178 |
| 0.30968999999999824 | -40.029 |
| 0.3099999999999982 | -39.878 |
| 0.3103099999999982 | -39.726 |
| 0.3106199999999982 | -39.573 |
| 0.31092999999999815 | -39.418 |
| 0.31123999999999813 | -39.261 |
| 0.3115499999999981 | -39.104 |
| 0.3118599999999981 | -38.944 |
| 0.31216999999999806 | -38.783 |
| 0.31247999999999804 | -38.621 |
| 0.312789999999998 | -38.458 |
| 0.313099999999998 | -38.292 |
| 0.31340999999999797 | -38.126 |
| 0.31371999999999794 | -37.958 |
| 0.3140299999999979 | -37.789 |
| 0.3143399999999979 | -37.618 |
| 0.3146499999999979 | -37.446 |
| 0.31495999999999785 | -37.272 |
| 0.31526999999999783 | -37.098 |
| 0.3155799999999978 | -36.921 |
| 0.3158899999999978 | -36.744 |
| 0.31619999999999776 | -36.565 |
| 0.31650999999999774 | -36.384 |
| 0.3168199999999977 | -36.203 |
| 0.3171299999999977 | -36.02 |
| 0.31743999999999767 | -35.835 |
| 0.31774999999999765 | -35.65 |
| 0.3180599999999976 | -35.463 |
| 0.3183699999999976 | -35.275 |
| 0.3186799999999976 | -35.085 |
| 0.31898999999999755 | -34.894 |
| 0.31929999999999753 | -34.702 |
| 0.3196099999999975 | -34.509 |
| 0.3199199999999975 | -34.314 |
| 0.32022999999999746 | -34.118 |
| 0.32053999999999744 | -33.921 |
| 0.3208499999999974 | -33.722 |
| 0.3211599999999974 | -33.523 |
| 0.32146999999999737 | -33.322 |
| 0.32177999999999735 | -33.12 |
| 0.3220899999999973 | -32.916 |
| 0.3223999999999973 | -32.712 |
| 0.3227099999999973 | -32.506 |
| 0.32301999999999725 | -32.299 |
| 0.32332999999999723 | -32.091 |
| 0.3236399999999972 | -31.882 |
| 0.3239499999999972 | -31.672 |
| 0.32425999999999716 | -31.46 |
| 0.32456999999999714 | -31.247 |
| 0.3248799999999971 | -31.033 |
| 0.3251899999999971 | -30.818 |
| 0.32549999999999707 | -30.602 |
| 0.32580999999999705 | -30.385 |
| 0.326119999999997 | -30.167 |
| 0.326429999999997 | -29.948 |
| 0.326739999999997 | -29.727 |
| 0.32704999999999695 | -29.506 |
| 0.32735999999999693 | -29.283 |
| 0.3276699999999969 | -29.059 |
| 0.3279799999999969 | -28.835 |
| 0.32828999999999686 | -28.609 |
| 0.32859999999999684 | -28.382 |
| 0.3289099999999968 | -28.154 |
| 0.3292199999999968 | -27.925 |
| 0.32952999999999677 | -27.696 |
| 0.32983999999999675 | -27.465 |
| 0.3301499999999967 | -27.233 |
| 0.3304599999999967 | -27 |
| 0.3307699999999967 | -26.767 |
| 0.33107999999999665 | -26.532 |
| 0.33138999999999663 | -26.296 |
| 0.3316999999999966 | -26.06 |
| 0.3320099999999966 | -25.822 |
| 0.33231999999999656 | -25.584 |
| 0.33262999999999654 | -25.344 |
| 0.3329399999999965 | -25.104 |
| 0.3332499999999965 | -24.863 |
| 0.33355999999999647 | -24.621 |
| 0.33386999999999645 | -24.378 |
| 0.3341799999999964 | -24.135 |
| 0.3344899999999964 | -23.89 |
| 0.3347999999999964 | -23.645 |
| 0.33510999999999636 | -23.398 |
| 0.33541999999999633 | -23.151 |
| 0.3357299999999963 | -22.903 |
| 0.3360399999999963 | -22.655 |
| 0.33634999999999626 | -22.405 |
| 0.33665999999999624 | -22.155 |
| 0.3369699999999962 | -21.904 |
| 0.3372799999999962 | -21.652 |
| 0.33758999999999617 | -21.399 |
| 0.33789999999999615 | -21.146 |
| 0.3382099999999961 | -20.892 |
| 0.3385199999999961 | -20.637 |
| 0.3388299999999961 | -20.382 |
| 0.33913999999999606 | -20.126 |
| 0.33944999999999603 | -19.869 |
| 0.339759999999996 | -19.611 |
| 0.340069999999996 | -19.353 |
| 0.34037999999999596 | -19.094 |
| 0.34068999999999594 | -18.835 |
| 0.3409999999999959 | -18.574 |
| 0.3413099999999959 | -18.314 |
| 0.34161999999999587 | -18.052 |
| 0.34192999999999585 | -17.79 |
| 0.3422399999999958 | -17.527 |
| 0.3425499999999958 | -17.264 |
| 0.3428599999999958 | -17 |
| 0.34316999999999576 | -16.736 |
| 0.34347999999999573 | -16.471 |
| 0.3437899999999957 | -16.205 |
| 0.3440999999999957 | -15.939 |
| 0.34440999999999566 | -15.673 |
| 0.34471999999999564 | -15.406 |
| 0.3450299999999956 | -15.138 |
| 0.3453399999999956 | -14.87 |
| 0.34564999999999557 | -14.601 |
| 0.34595999999999555 | -14.332 |
| 0.3462699999999955 | -14.062 |
| 0.3465799999999955 | -13.792 |
| 0.3468899999999955 | -13.522 |
| 0.34719999999999546 | -13.251 |
| 0.34750999999999543 | -12.98 |
| 0.3478199999999954 | -12.708 |
| 0.3481299999999954 | -12.436 |
| 0.34843999999999536 | -12.163 |
| 0.34874999999999534 | -11.89 |
| 0.3490599999999953 | -11.617 |
| 0.3493699999999953 | -11.344 |
| 0.3496799999999953 | -11.069 |
| 0.34998999999999525 | -10.795 |
| 0.3502999999999952 | -10.52 |
| 0.3506099999999952 | -10.245 |
| 0.3509199999999952 | -9.97 |
| 0.35122999999999516 | -9.695 |
| 0.35153999999999513 | -9.419 |
| 0.3518499999999951 | -9.143 |
| 0.3521599999999951 | -8.866 |
| 0.35246999999999507 | -8.589 |
| 0.35277999999999504 | -8.312 |
| 0.353089999999995 | -8.035 |
| 0.353399999999995 | -7.758 |
| 0.353709999999995 | -7.48 |
| 0.35401999999999495 | -7.203 |
| 0.3543299999999949 | -6.925 |
| 0.3546399999999949 | -6.646 |
| 0.3549499999999949 | -6.368 |
| 0.35525999999999486 | -6.09 |
| 0.35556999999999483 | -5.811 |
| 0.3558799999999948 | -5.532 |
| 0.3561899999999948 | -5.253 |
| 0.35649999999999477 | -4.974 |
| 0.35680999999999474 | -4.695 |
| 0.3571199999999947 | -4.416 |
| 0.3574299999999947 | -4.137 |
| 0.3577399999999947 | -3.857 |
| 0.35804999999999465 | -3.578 |
| 0.3583599999999946 | -3.298 |
| 0.3586699999999946 | -3.019 |
| 0.3589799999999946 | -2.739 |
| 0.35928999999999456 | -2.46 |
| 0.35959999999999454 | -2.18 |
| 0.3599099999999945 | -1.9 |
| 0.3602199999999945 | -1.621 |
| 0.36052999999999447 | -1.341 |
| 0.36083999999999444 | -1.062 |
| 0.3611499999999944 | -0.782 |
| 0.3614599999999944 | -0.503 |
| 0.3617699999999944 | -0.223 |
| 0.36207999999999435 | 0.056 |
| 0.36238999999999433 | 0.335 |
| 0.3626999999999943 | 0.614 |
| 0.3630099999999943 | 0.893 |
| 0.36331999999999426 | 1.172 |
| 0.36362999999999424 | 1.451 |
| 0.3639399999999942 | 1.729 |
| 0.3642499999999942 | 2.008 |
| 0.36455999999999417 | 2.286 |
| 0.36486999999999414 | 2.564 |
| 0.3651799999999941 | 2.842 |
| 0.3654899999999941 | 3.119 |
| 0.3657999999999941 | 3.397 |
| 0.36610999999999405 | 3.674 |
| 0.36641999999999403 | 3.951 |
| 0.366729999999994 | 4.228 |
| 0.367039999999994 | 4.505 |
| 0.36734999999999396 | 4.781 |
| 0.36765999999999394 | 5.057 |
| 0.3679699999999939 | 5.333 |
| 0.3682799999999939 | 5.608 |
| 0.36858999999999387 | 5.883 |
| 0.36889999999999384 | 6.158 |
| 0.3692099999999938 | 6.433 |
| 0.3695199999999938 | 6.707 |
| 0.3698299999999938 | 6.981 |
| 0.37013999999999375 | 7.254 |
| 0.37044999999999373 | 7.527 |
| 0.3707599999999937 | 7.8 |
| 0.3710699999999937 | 8.073 |
| 0.37137999999999366 | 8.345 |
| 0.37168999999999364 | 8.616 |
| 0.3719999999999936 | 8.887 |
| 0.3723099999999936 | 9.158 |
| 0.37261999999999357 | 9.428 |
| 0.37292999999999354 | 9.698 |
| 0.3732399999999935 | 9.968 |
| 0.3735499999999935 | 10.237 |
| 0.3738599999999935 | 10.505 |
| 0.37416999999999345 | 10.773 |
| 0.37447999999999343 | 11.041 |
| 0.3747899999999934 | 11.308 |
| 0.3750999999999934 | 11.574 |
| 0.37540999999999336 | 11.84 |
| 0.37571999999999334 | 12.105 |
| 0.3760299999999933 | 12.37 |
| 0.3763399999999933 | 12.634 |
| 0.37664999999999327 | 12.898 |
| 0.37695999999999324 | 13.161 |
| 0.3772699999999932 | 13.424 |
| 0.3775799999999932 | 13.686 |
| 0.3778899999999932 | 13.947 |
| 0.37819999999999315 | 14.208 |
| 0.37850999999999313 | 14.468 |
| 0.3788199999999931 | 14.727 |
| 0.3791299999999931 | 14.986 |
| 0.37943999999999306 | 15.244 |
| 0.37974999999999304 | 15.502 |
| 0.380059999999993 | 15.759 |
| 0.380369999999993 | 16.015 |
| 0.38067999999999297 | 16.27 |
| 0.38098999999999295 | 16.525 |
| 0.3812999999999929 | 16.779 |
| 0.3816099999999929 | 17.032 |
| 0.3819199999999929 | 17.285 |
| 0.38222999999999285 | 17.537 |
| 0.38253999999999283 | 17.788 |
| 0.3828499999999928 | 18.038 |
| 0.3831599999999928 | 18.288 |
| 0.38346999999999276 | 18.536 |
| 0.38377999999999274 | 18.784 |
| 0.3840899999999927 | 19.031 |
| 0.3843999999999927 | 19.278 |
| 0.38470999999999267 | 19.523 |
| 0.38501999999999265 | 19.768 |
| 0.3853299999999926 | 20.012 |
| 0.3856399999999926 | 20.255 |
| 0.3859499999999926 | 20.497 |
| 0.38625999999999255 | 20.739 |
| 0.38656999999999253 | 20.979 |
| 0.3868799999999925 | 21.219 |
| 0.3871899999999925 | 21.457 |
| 0.38749999999999246 | 21.695 |
| 0.38780999999999244 | 21.932 |
| 0.3881199999999924 | 22.168 |
| 0.3884299999999924 | 22.403 |
| 0.38873999999999237 | 22.637 |
| 0.38904999999999235 | 22.87 |
| 0.3893599999999923 | 23.102 |
| 0.3896699999999923 | 23.334 |
| 0.3899799999999923 | 23.564 |
| 0.39028999999999225 | 23.793 |
| 0.39059999999999223 | 24.021 |
| 0.3909099999999922 | 24.249 |
| 0.3912199999999922 | 24.475 |
| 0.39152999999999216 | 24.7 |
| 0.39183999999999214 | 24.925 |
| 0.3921499999999921 | 25.148 |
| 0.3924599999999921 | 25.37 |
| 0.39276999999999207 | 25.591 |
| 0.39307999999999205 | 25.811 |
| 0.393389999999992 | 26.03 |
| 0.393699999999992 | 26.248 |
| 0.394009999999992 | 26.465 |
| 0.39431999999999195 | 26.681 |
| 0.39462999999999193 | 26.896 |
| 0.3949399999999919 | 27.11 |
| 0.3952499999999919 | 27.322 |
| 0.39555999999999186 | 27.534 |
| 0.39586999999999184 | 27.744 |
| 0.3961799999999918 | 27.953 |
| 0.3964899999999918 | 28.161 |
| 0.39679999999999177 | 28.368 |
| 0.39710999999999175 | 28.574 |
| 0.3974199999999917 | 28.778 |
| 0.3977299999999917 | 28.982 |
| 0.3980399999999917 | 29.184 |
| 0.39834999999999166 | 29.385 |
| 0.39865999999999163 | 29.585 |
| 0.3989699999999916 | 29.783 |
| 0.3992799999999916 | 29.981 |
| 0.39958999999999156 | 30.177 |
| 0.39989999999999154 | 30.372 |
| 0.4002099999999915 | 30.566 |
| 0.4005199999999915 | 30.758 |
| 0.40082999999999147 | 30.95 |
| 0.40113999999999145 | 31.14 |
| 0.4014499999999914 | 31.328 |
| 0.4017599999999914 | 31.516 |
| 0.4020699999999914 | 31.702 |
| 0.40237999999999136 | 31.887 |
| 0.40268999999999133 | 32.071 |
| 0.4029999999999913 | 32.253 |
| 0.4033099999999913 | 32.434 |
| 0.40361999999999126 | 32.614 |
| 0.40392999999999124 | 32.793 |
| 0.4042399999999912 | 32.97 |
| 0.4045499999999912 | 33.146 |
| 0.40485999999999117 | 33.32 |
| 0.40516999999999115 | 33.494 |
| 0.4054799999999911 | 33.665 |
| 0.4057899999999911 | 33.836 |
| 0.4060999999999911 | 34.005 |
| 0.40640999999999106 | 34.173 |
| 0.40671999999999103 | 34.339 |
| 0.407029999999991 | 34.504 |
| 0.407339999999991 | 34.668 |
| 0.40764999999999096 | 34.83 |
| 0.40795999999999094 | 34.991 |
| 0.4082699999999909 | 35.151 |
| 0.4085799999999909 | 35.309 |
| 0.40888999999999087 | 35.466 |
| 0.40919999999999085 | 35.621 |
| 0.4095099999999908 | 35.775 |
| 0.4098199999999908 | 35.927 |
| 0.4101299999999908 | 36.078 |
| 0.41043999999999076 | 36.228 |
| 0.41074999999999073 | 36.376 |
| 0.4110599999999907 | 36.523 |
| 0.4113699999999907 | 36.668 |
| 0.41167999999999066 | 36.812 |
| 0.41198999999999064 | 36.954 |
| 0.4122999999999906 | 37.095 |
| 0.4126099999999906 | 37.235 |
| 0.4129199999999906 | 37.372 |
| 0.41322999999999055 | 37.509 |
| 0.4135399999999905 | 37.644 |
| 0.4138499999999905 | 37.777 |
| 0.4141599999999905 | 37.909 |
| 0.41446999999999046 | 38.04 |
| 0.41477999999999043 | 38.169 |
| 0.4150899999999904 | 38.296 |
| 0.4153999999999904 | 38.422 |
| 0.41570999999999037 | 38.547 |
| 0.41601999999999034 | 38.67 |
| 0.4163299999999903 | 38.791 |
| 0.4166399999999903 | 38.911 |
| 0.4169499999999903 | 39.03 |
| 0.41725999999999025 | 39.146 |
| 0.4175699999999902 | 39.262 |
| 0.4178799999999902 | 39.375 |
| 0.4181899999999902 | 39.488 |
| 0.41849999999999016 | 39.598 |
| 0.41880999999999013 | 39.707 |
| 0.4191199999999901 | 39.815 |
| 0.4194299999999901 | 39.921 |
| 0.41973999999999007 | 40.025 |
| 0.42004999999999004 | 40.128 |
| 0.42035999999999 | 40.229 |
| 0.42066999999999 | 40.329 |
| 0.42097999999999 | 40.427 |
| 0.42128999999998995 | 40.523 |
| 0.4215999999999899 | 40.618 |
| 0.4219099999999899 | 40.712 |
| 0.4222199999999899 | 40.803 |
| 0.42252999999998986 | 40.894 |
| 0.42283999999998984 | 40.982 |
| 0.4231499999999898 | 41.069 |
| 0.4234599999999898 | 41.154 |
| 0.42376999999998977 | 41.238 |
| 0.42407999999998974 | 41.32 |
| 0.4243899999999897 | 41.401 |
| 0.4246999999999897 | 41.48 |
| 0.4250099999999897 | 41.557 |
| 0.42531999999998965 | 41.632 |
| 0.4256299999999896 | 41.706 |
| 0.4259399999999896 | 41.779 |
| 0.4262499999999896 | 41.85 |
| 0.42655999999998956 | 41.919 |
| 0.42686999999998954 | 41.986 |
| 0.4271799999999895 | 42.052 |
| 0.4274899999999895 | 42.116 |
| 0.42779999999998947 | 42.179 |
| 0.42810999999998944 | 42.24 |
| 0.4284199999999894 | 42.299 |
| 0.4287299999999894 | 42.357 |
| 0.4290399999999894 | 42.413 |
| 0.42934999999998935 | 42.467 |
| 0.42965999999998933 | 42.52 |
| 0.4299699999999893 | 42.571 |
| 0.4302799999999893 | 42.62 |
| 0.43058999999998926 | 42.668 |
| 0.43089999999998924 | 42.714 |
| 0.4312099999999892 | 42.759 |
| 0.4315199999999892 | 42.802 |
| 0.43182999999998917 | 42.843 |
| 0.43213999999998914 | 42.882 |
| 0.4324499999999891 | 42.92 |
| 0.4327599999999891 | 42.956 |
| 0.4330699999999891 | 42.991 |
| 0.43337999999998905 | 43.023 |
| 0.43368999999998903 | 43.055 |
| 0.433999999999989 | 43.084 |
| 0.434309999999989 | 43.112 |
| 0.43461999999998896 | 43.138 |
| 0.43492999999998894 | 43.163 |
| 0.4352399999999889 | 43.186 |
| 0.4355499999999889 | 43.207 |
| 0.43585999999998887 | 43.226 |
| 0.43616999999998884 | 43.244 |
| 0.4364799999999888 | 43.26 |
| 0.4367899999999888 | 43.275 |
| 0.4370999999999888 | 43.288 |
| 0.43740999999998875 | 43.299 |
| 0.43771999999998873 | 43.308 |
| 0.4380299999999887 | 43.316 |
| 0.4383399999999887 | 43.322 |
| 0.43864999999998866 | 43.327 |
| 0.43895999999998864 | 43.33 |
| 0.4392699999999886 | 43.331 |
| 0.4395799999999886 | 43.33 |
| 0.43988999999998857 | 43.328 |
| 0.44019999999998854 | 43.324 |
| 0.4405099999999885 | 43.319 |
| 0.4408199999999885 | 43.312 |
| 0.4411299999999885 | 43.303 |
| 0.44143999999998845 | 43.292 |
| 0.44174999999998843 | 43.28 |
| 0.4420599999999884 | 43.266 |
| 0.4423699999999884 | 43.251 |
| 0.44267999999998836 | 43.234 |
| 0.44298999999998834 | 43.215 |
| 0.4432999999999883 | 43.195 |
| 0.4436099999999883 | 43.172 |
| 0.44391999999998827 | 43.149 |
| 0.44422999999998825 | 43.123 |
| 0.4445399999999882 | 43.096 |
| 0.4448499999999882 | 43.068 |
| 0.4451599999999882 | 43.037 |
| 0.44546999999998815 | 43.005 |
| 0.44577999999998813 | 42.972 |
| 0.4460899999999881 | 42.936 |
| 0.4463999999999881 | 42.9 |
| 0.44670999999998806 | 42.861 |
| 0.44701999999998804 | 42.821 |
| 0.447329999999988 | 42.779 |
| 0.447639999999988 | 42.736 |
| 0.44794999999998797 | 42.691 |
| 0.44825999999998795 | 42.644 |
| 0.4485699999999879 | 42.596 |
| 0.4488799999999879 | 42.546 |
| 0.4491899999999879 | 42.494 |
| 0.44949999999998785 | 42.441 |
| 0.44980999999998783 | 42.386 |
| 0.4501199999999878 | 42.33 |
| 0.4504299999999878 | 42.272 |
| 0.45073999999998776 | 42.212 |
| 0.45104999999998774 | 42.151 |
| 0.4513599999999877 | 42.088 |
| 0.4516699999999877 | 42.024 |
| 0.45197999999998767 | 41.958 |
| 0.45228999999998765 | 41.89 |
| 0.4525999999999876 | 41.821 |
| 0.4529099999999876 | 41.75 |
| 0.4532199999999876 | 41.678 |
| 0.45352999999998755 | 41.604 |
| 0.45383999999998753 | 41.528 |
| 0.4541499999999875 | 41.451 |
| 0.4544599999999875 | 41.372 |
| 0.45476999999998746 | 41.292 |
| 0.45507999999998744 | 41.21 |
| 0.4553899999999874 | 41.127 |
| 0.4556999999999874 | 41.042 |
| 0.45600999999998737 | 40.956 |
| 0.45631999999998735 | 40.868 |
| 0.4566299999999873 | 40.778 |
| 0.4569399999999873 | 40.687 |
| 0.4572499999999873 | 40.594 |
| 0.45755999999998725 | 40.5 |
| 0.45786999999998723 | 40.405 |
| 0.4581799999999872 | 40.307 |
| 0.4584899999999872 | 40.209 |
| 0.45879999999998716 | 40.108 |
| 0.45910999999998714 | 40.007 |
| 0.4594199999999871 | 39.903 |
| 0.4597299999999871 | 39.799 |
| 0.46003999999998707 | 39.692 |
| 0.46034999999998705 | 39.585 |
| 0.460659999999987 | 39.475 |
| 0.460969999999987 | 39.365 |
| 0.461279999999987 | 39.252 |
| 0.46158999999998696 | 39.139 |
| 0.46189999999998693 | 39.024 |
| 0.4622099999999869 | 38.907 |
| 0.4625199999999869 | 38.789 |
| 0.46282999999998686 | 38.67 |
| 0.46313999999998684 | 38.549 |
| 0.4634499999999868 | 38.426 |
| 0.4637599999999868 | 38.302 |
| 0.46406999999998677 | 38.177 |
| 0.46437999999998675 | 38.05 |
| 0.4646899999999867 | 37.922 |
| 0.4649999999999867 | 37.793 |
| 0.4653099999999867 | 37.662 |
| 0.46561999999998666 | 37.529 |
| 0.46592999999998663 | 37.396 |
| 0.4662399999999866 | 37.26 |
| 0.4665499999999866 | 37.124 |
| 0.46685999999998656 | 36.986 |
| 0.46716999999998654 | 36.847 |
| 0.4674799999999865 | 36.706 |
| 0.4677899999999865 | 36.564 |
| 0.46809999999998647 | 36.42 |
| 0.46840999999998645 | 36.276 |
| 0.4687199999999864 | 36.129 |
| 0.4690299999999864 | 35.982 |
| 0.4693399999999864 | 35.833 |
| 0.46964999999998636 | 35.683 |
| 0.46995999999998633 | 35.532 |
| 0.4702699999999863 | 35.379 |
| 0.4705799999999863 | 35.225 |
| 0.47088999999998626 | 35.069 |
| 0.47119999999998624 | 34.913 |
| 0.4715099999999862 | 34.755 |
| 0.4718199999999862 | 34.595 |
| 0.47212999999998617 | 34.435 |
| 0.47243999999998615 | 34.273 |
| 0.4727499999999861 | 34.11 |
| 0.4730599999999861 | 33.945 |
| 0.4733699999999861 | 33.78 |
| 0.47367999999998606 | 33.613 |
| 0.47398999999998603 | 33.445 |
| 0.474299999999986 | 33.276 |
| 0.474609999999986 | 33.105 |
| 0.47491999999998596 | 32.933 |
| 0.47522999999998594 | 32.76 |
| 0.4755399999999859 | 32.586 |
| 0.4758499999999859 | 32.411 |
| 0.4761599999999859 | 32.234 |
| 0.47646999999998585 | 32.056 |
| 0.4767799999999858 | 31.877 |
| 0.4770899999999858 | 31.697 |
| 0.4773999999999858 | 31.516 |
| 0.47770999999998576 | 31.333 |
| 0.47801999999998573 | 31.15 |
| 0.4783299999999857 | 30.965 |
| 0.4786399999999857 | 30.779 |
| 0.47894999999998566 | 30.592 |
| 0.47925999999998564 | 30.404 |
| 0.4795699999999856 | 30.215 |
| 0.4798799999999856 | 30.025 |
| 0.4801899999999856 | 29.833 |
| 0.48049999999998555 | 29.641 |
| 0.4808099999999855 | 29.447 |
| 0.4811199999999855 | 29.253 |
| 0.4814299999999855 | 29.057 |
| 0.48173999999998546 | 28.86 |
| 0.48204999999998543 | 28.662 |
| 0.4823599999999854 | 28.463 |
| 0.4826699999999854 | 28.264 |
| 0.48297999999998537 | 28.063 |
| 0.48328999999998534 | 27.861 |
| 0.4835999999999853 | 27.658 |
| 0.4839099999999853 | 27.454 |
| 0.4842199999999853 | 27.249 |
| 0.48452999999998525 | 27.043 |
| 0.4848399999999852 | 26.836 |
| 0.4851499999999852 | 26.628 |
| 0.4854599999999852 | 26.419 |
| 0.48576999999998516 | 26.21 |
| 0.48607999999998514 | 25.999 |
| 0.4863899999999851 | 25.787 |
| 0.4866999999999851 | 25.575 |
| 0.48700999999998507 | 25.361 |
| 0.48731999999998504 | 25.147 |
| 0.487629999999985 | 24.932 |
| 0.487939999999985 | 24.715 |
| 0.488249999999985 | 24.498 |
| 0.48855999999998495 | 24.28 |
| 0.4888699999999849 | 24.062 |
| 0.4891799999999849 | 23.842 |
| 0.4894899999999849 | 23.621 |
| 0.48979999999998486 | 23.4 |
| 0.49010999999998484 | 23.178 |
| 0.4904199999999848 | 22.955 |
| 0.4907299999999848 | 22.731 |
| 0.49103999999998477 | 22.506 |
| 0.49134999999998474 | 22.281 |
| 0.4916599999999847 | 22.055 |
| 0.4919699999999847 | 21.828 |
| 0.4922799999999847 | 21.6 |
| 0.49258999999998465 | 21.372 |
| 0.49289999999998463 | 21.142 |
| 0.4932099999999846 | 20.912 |
| 0.4935199999999846 | 20.682 |
| 0.49382999999998456 | 20.45 |
| 0.49413999999998454 | 20.218 |
| 0.4944499999999845 | 19.985 |
| 0.4947599999999845 | 19.751 |
| 0.49506999999998447 | 19.517 |
| 0.49537999999998444 | 19.282 |
| 0.4956899999999844 | 19.047 |
| 0.4959999999999844 | 18.81 |
| 0.4963099999999844 | 18.573 |
| 0.49661999999998435 | 18.336 |
| 0.49692999999998433 | 18.098 |
| 0.4972399999999843 | 17.859 |
| 0.4975499999999843 | 17.619 |
| 0.49785999999998426 | 17.379 |
| 0.49816999999998424 | 17.139 |
| 0.4984799999999842 | 16.898 |
| 0.4987899999999842 | 16.656 |
| 0.49909999999998417 | 16.414 |
| 0.49940999999998414 | 16.171 |
| 0.4997199999999841 | 15.927 |
| 0.5000299999999841 | 15.683 |
| 0.5003399999999841 | 15.439 |
| 0.5006499999999842 | 15.194 |
| 0.5009599999999842 | 14.948 |
| 0.5012699999999842 | 14.702 |
| 0.5015799999999843 | 14.456 |
| 0.5018899999999843 | 14.209 |
| 0.5021999999999843 | 13.961 |
| 0.5025099999999844 | 13.713 |
| 0.5028199999999844 | 13.465 |
| 0.5031299999999844 | 13.216 |
| 0.5034399999999845 | 12.967 |
| 0.5037499999999845 | 12.717 |
| 0.5040599999999845 | 12.467 |
| 0.5043699999999846 | 12.217 |
| 0.5046799999999846 | 11.966 |
| 0.5049899999999846 | 11.714 |
| 0.5052999999999847 | 11.463 |
| 0.5056099999999847 | 11.211 |
| 0.5059199999999847 | 10.958 |
| 0.5062299999999847 | 10.706 |
| 0.5065399999999848 | 10.453 |
| 0.5068499999999848 | 10.199 |
| 0.5071599999999848 | 9.946 |
| 0.5074699999999849 | 9.692 |
| 0.5077799999999849 | 9.438 |
| 0.5080899999999849 | 9.183 |
| 0.508399999999985 | 8.928 |
| 0.508709999999985 | 8.673 |
| 0.509019999999985 | 8.418 |
| 0.5093299999999851 | 8.162 |
| 0.5096399999999851 | 7.906 |
| 0.5099499999999851 | 7.65 |
| 0.5102599999999852 | 7.394 |
| 0.5105699999999852 | 7.138 |
| 0.5108799999999852 | 6.881 |
| 0.5111899999999853 | 6.624 |
| 0.5114999999999853 | 6.367 |
| 0.5118099999999853 | 6.11 |
| 0.5121199999999854 | 5.853 |
| 0.5124299999999854 | 5.595 |
| 0.5127399999999854 | 5.338 |
| 0.5130499999999855 | 5.08 |
| 0.5133599999999855 | 4.822 |
| 0.5136699999999855 | 4.564 |
| 0.5139799999999856 | 4.306 |
| 0.5142899999999856 | 4.048 |
| 0.5145999999999856 | 3.79 |
| 0.5149099999999857 | 3.531 |
| 0.5152199999999857 | 3.273 |
| 0.5155299999999857 | 3.015 |
| 0.5158399999999858 | 2.756 |
| 0.5161499999999858 | 2.498 |
| 0.5164599999999858 | 2.239 |
| 0.5167699999999859 | 1.981 |
| 0.5170799999999859 | 1.722 |
| 0.5173899999999859 | 1.464 |
| 0.517699999999986 | 1.205 |
| 0.518009999999986 | 0.947 |
| 0.518319999999986 | 0.689 |
| 0.518629999999986 | 0.43 |
| 0.5189399999999861 | 0.172 |
| 0.5192499999999861 | -0.086 |
| 0.5195599999999861 | -0.344 |
| 0.5198699999999862 | -0.602 |
| 0.5201799999999862 | -0.86 |
| 0.5204899999999862 | -1.118 |
| 0.5207999999999863 | -1.375 |
| 0.5211099999999863 | -1.633 |
| 0.5214199999999863 | -1.89 |
| 0.5217299999999864 | -2.147 |
| 0.5220399999999864 | -2.404 |
| 0.5223499999999864 | -2.661 |
| 0.5226599999999865 | -2.918 |
| 0.5229699999999865 | -3.174 |
| 0.5232799999999865 | -3.431 |
| 0.5235899999999866 | -3.687 |
| 0.5238999999999866 | -3.943 |
| 0.5242099999999866 | -4.198 |
| 0.5245199999999867 | -4.454 |
| 0.5248299999999867 | -4.709 |
| 0.5251399999999867 | -4.964 |
| 0.5254499999999868 | -5.218 |
| 0.5257599999999868 | -5.473 |
| 0.5260699999999868 | -5.727 |
| 0.5263799999999869 | -5.98 |
| 0.5266899999999869 | -6.234 |
| 0.5269999999999869 | -6.487 |
| 0.527309999999987 | -6.74 |
| 0.527619999999987 | -6.992 |
| 0.527929999999987 | -7.244 |
| 0.528239999999987 | -7.496 |
| 0.5285499999999871 | -7.748 |
| 0.5288599999999871 | -7.999 |
| 0.5291699999999872 | -8.249 |
| 0.5294799999999872 | -8.499 |
| 0.5297899999999872 | -8.749 |
| 0.5300999999999872 | -8.999 |
| 0.5304099999999873 | -9.248 |
| 0.5307199999999873 | -9.496 |
| 0.5310299999999873 | -9.744 |
| 0.5313399999999874 | -9.992 |
| 0.5316499999999874 | -10.239 |
| 0.5319599999999874 | -10.486 |
| 0.5322699999999875 | -10.732 |
| 0.5325799999999875 | -10.978 |
| 0.5328899999999875 | -11.223 |
| 0.5331999999999876 | -11.468 |
| 0.5335099999999876 | -11.712 |
| 0.5338199999999876 | -11.956 |
| 0.5341299999999877 | -12.199 |
| 0.5344399999999877 | -12.442 |
| 0.5347499999999877 | -12.684 |
| 0.5350599999999878 | -12.925 |
| 0.5353699999999878 | -13.166 |
| 0.5356799999999878 | -13.407 |
| 0.5359899999999879 | -13.646 |
| 0.5362999999999879 | -13.886 |
| 0.5366099999999879 | -14.124 |
| 0.536919999999988 | -14.362 |
| 0.537229999999988 | -14.6 |
| 0.537539999999988 | -14.836 |
| 0.5378499999999881 | -15.072 |
| 0.5381599999999881 | -15.308 |
| 0.5384699999999881 | -15.542 |
| 0.5387799999999882 | -15.776 |
| 0.5390899999999882 | -16.01 |
| 0.5393999999999882 | -16.243 |
| 0.5397099999999883 | -16.475 |
| 0.5400199999999883 | -16.706 |
| 0.5403299999999883 | -16.936 |
| 0.5406399999999884 | -17.166 |
| 0.5409499999999884 | -17.395 |
| 0.5412599999999884 | -17.624 |
| 0.5415699999999884 | -17.852 |
| 0.5418799999999885 | -18.078 |
| 0.5421899999999885 | -18.305 |
| 0.5424999999999885 | -18.53 |
| 0.5428099999999886 | -18.754 |
| 0.5431199999999886 | -18.978 |
| 0.5434299999999886 | -19.201 |
| 0.5437399999999887 | -19.423 |
| 0.5440499999999887 | -19.645 |
| 0.5443599999999887 | -19.865 |
| 0.5446699999999888 | -20.085 |
| 0.5449799999999888 | -20.304 |
| 0.5452899999999888 | -20.522 |
| 0.5455999999999889 | -20.739 |
| 0.5459099999999889 | -20.955 |
| 0.5462199999999889 | -21.171 |
| 0.546529999999989 | -21.385 |
| 0.546839999999989 | -21.599 |
| 0.547149999999989 | -21.812 |
| 0.5474599999999891 | -22.024 |
| 0.5477699999999891 | -22.234 |
| 0.5480799999999891 | -22.444 |
| 0.5483899999999892 | -22.654 |
| 0.5486999999999892 | -22.862 |
| 0.5490099999999892 | -23.069 |
| 0.5493199999999893 | -23.275 |
| 0.5496299999999893 | -23.48 |
| 0.5499399999999893 | -23.685 |
| 0.5502499999999894 | -23.888 |
| 0.5505599999999894 | -24.091 |
| 0.5508699999999894 | -24.292 |
| 0.5511799999999895 | -24.492 |
| 0.5514899999999895 | -24.692 |
| 0.5517999999999895 | -24.89 |
| 0.5521099999999896 | -25.088 |
| 0.5524199999999896 | -25.284 |
| 0.5527299999999896 | -25.479 |
| 0.5530399999999897 | -25.673 |
| 0.5533499999999897 | -25.867 |
| 0.5536599999999897 | -26.059 |
| 0.5539699999999897 | -26.25 |
| 0.5542799999999898 | -26.44 |
| 0.5545899999999898 | -26.629 |
| 0.5548999999999898 | -26.817 |
| 0.5552099999999899 | -27.004 |
| 0.5555199999999899 | -27.189 |
| 0.5558299999999899 | -27.374 |
| 0.55613999999999 | -27.557 |
| 0.55644999999999 | -27.74 |
| 0.55675999999999 | -27.921 |
| 0.5570699999999901 | -28.101 |
| 0.5573799999999901 | -28.28 |
| 0.5576899999999901 | -28.458 |
| 0.5579999999999902 | -28.635 |
| 0.5583099999999902 | -28.81 |
| 0.5586199999999902 | -28.984 |
| 0.5589299999999903 | -29.158 |
| 0.5592399999999903 | -29.33 |
| 0.5595499999999903 | -29.501 |
| 0.5598599999999904 | -29.67 |
| 0.5601699999999904 | -29.839 |
| 0.5604799999999904 | -30.006 |
| 0.5607899999999905 | -30.172 |
| 0.5610999999999905 | -30.337 |
| 0.5614099999999905 | -30.501 |
| 0.5617199999999906 | -30.663 |
| 0.5620299999999906 | -30.824 |
| 0.5623399999999906 | -30.984 |
| 0.5626499999999907 | -31.143 |
| 0.5629599999999907 | -31.3 |
| 0.5632699999999907 | -31.456 |
| 0.5635799999999908 | -31.611 |
| 0.5638899999999908 | -31.765 |
| 0.5641999999999908 | -31.918 |
| 0.5645099999999909 | -32.069 |
| 0.5648199999999909 | -32.219 |
| 0.5651299999999909 | -32.367 |
| 0.565439999999991 | -32.514 |
| 0.565749999999991 | -32.66 |
| 0.566059999999991 | -32.805 |
| 0.566369999999991 | -32.949 |
| 0.5666799999999911 | -33.091 |
| 0.5669899999999911 | -33.231 |
| 0.5672999999999911 | -33.371 |
| 0.5676099999999912 | -33.509 |
| 0.5679199999999912 | -33.646 |
| 0.5682299999999912 | -33.781 |
| 0.5685399999999913 | -33.915 |
| 0.5688499999999913 | -34.048 |
| 0.5691599999999913 | -34.179 |
| 0.5694699999999914 | -34.31 |
| 0.5697799999999914 | -34.438 |
| 0.5700899999999914 | -34.566 |
| 0.5703999999999915 | -34.692 |
| 0.5707099999999915 | -34.816 |
| 0.5710199999999915 | -34.939 |
| 0.5713299999999916 | -35.061 |
| 0.5716399999999916 | -35.182 |
| 0.5719499999999916 | -35.301 |
| 0.5722599999999917 | -35.418 |
| 0.5725699999999917 | -35.535 |
| 0.5728799999999917 | -35.65 |
| 0.5731899999999918 | -35.763 |
| 0.5734999999999918 | -35.875 |
| 0.5738099999999918 | -35.986 |
| 0.5741199999999919 | -36.095 |
| 0.5744299999999919 | -36.203 |
| 0.5747399999999919 | -36.309 |
| 0.575049999999992 | -36.414 |
| 0.575359999999992 | -36.518 |
| 0.575669999999992 | -36.62 |
| 0.575979999999992 | -36.72 |
| 0.5762899999999921 | -36.82 |
| 0.5765999999999921 | -36.917 |
| 0.5769099999999922 | -37.014 |
| 0.5772199999999922 | -37.109 |
| 0.5775299999999922 | -37.202 |
| 0.5778399999999922 | -37.294 |
| 0.5781499999999923 | -37.384 |
| 0.5784599999999923 | -37.473 |
| 0.5787699999999923 | -37.561 |
| 0.5790799999999924 | -37.647 |
| 0.5793899999999924 | -37.732 |
| 0.5796999999999924 | -37.815 |
| 0.5800099999999925 | -37.896 |
| 0.5803199999999925 | -37.977 |
| 0.5806299999999925 | -38.055 |
| 0.5809399999999926 | -38.132 |
| 0.5812499999999926 | -38.208 |
| 0.5815599999999926 | -38.282 |
| 0.5818699999999927 | -38.355 |
| 0.5821799999999927 | -38.426 |
| 0.5824899999999927 | -38.496 |
| 0.5827999999999928 | -38.564 |
| 0.5831099999999928 | -38.631 |
| 0.5834199999999928 | -38.696 |
| 0.5837299999999929 | -38.76 |
| 0.5840399999999929 | -38.822 |
| 0.5843499999999929 | -38.883 |
| 0.584659999999993 | -38.942 |
| 0.584969999999993 | -39 |
| 0.585279999999993 | -39.056 |
| 0.5855899999999931 | -39.11 |
| 0.5858999999999931 | -39.163 |
| 0.5862099999999931 | -39.215 |
| 0.5865199999999932 | -39.265 |
| 0.5868299999999932 | -39.314 |
| 0.5871399999999932 | -39.361 |
| 0.5874499999999933 | -39.406 |
| 0.5877599999999933 | -39.45 |
| 0.5880699999999933 | -39.492 |
| 0.5883799999999934 | -39.533 |
| 0.5886899999999934 | -39.573 |
| 0.5889999999999934 | -39.611 |
| 0.5893099999999935 | -39.647 |
| 0.5896199999999935 | -39.682 |
| 0.5899299999999935 | -39.715 |
| 0.5902399999999935 | -39.747 |
| 0.5905499999999936 | -39.777 |
| 0.5908599999999936 | -39.805 |
| 0.5911699999999936 | -39.832 |
| 0.5914799999999937 | -39.858 |
| 0.5917899999999937 | -39.882 |
| 0.5920999999999937 | -39.904 |
| 0.5924099999999938 | -39.925 |
| 0.5927199999999938 | -39.945 |
| 0.5930299999999938 | -39.962 |
| 0.5933399999999939 | -39.979 |
| 0.5936499999999939 | -39.993 |
| 0.5939599999999939 | -40.007 |
| 0.594269999999994 | -40.018 |
| 0.594579999999994 | -40.028 |
| 0.594889999999994 | -40.037 |
| 0.5951999999999941 | -40.044 |
| 0.5955099999999941 | -40.05 |
| 0.5958199999999941 | -40.053 |
| 0.5961299999999942 | -40.056 |
| 0.5964399999999942 | -40.057 |
| 0.5967499999999942 | -40.056 |
| 0.5970599999999943 | -40.054 |
| 0.5973699999999943 | -40.05 |
| 0.5976799999999943 | -40.045 |
| 0.5979899999999944 | -40.038 |
| 0.5982999999999944 | -40.03 |
| 0.5986099999999944 | -40.02 |
| 0.5989199999999945 | -40.008 |
| 0.5992299999999945 | -39.995 |
| 0.5995399999999945 | -39.981 |
| 0.5998499999999946 | -39.965 |
| 0.6001599999999946 | -39.947 |
| 0.6004699999999946 | -39.928 |
| 0.6007799999999947 | -39.908 |
| 0.6010899999999947 | -39.885 |
| 0.6013999999999947 | -39.862 |
| 0.6017099999999947 | -39.837 |
| 0.6020199999999948 | -39.81 |
| 0.6023299999999948 | -39.782 |
| 0.6026399999999948 | -39.752 |
| 0.6029499999999949 | -39.721 |
| 0.6032599999999949 | -39.688 |
| 0.6035699999999949 | -39.653 |
| 0.603879999999995 | -39.618 |
| 0.604189999999995 | -39.58 |
| 0.604499999999995 | -39.541 |
| 0.6048099999999951 | -39.501 |
| 0.6051199999999951 | -39.459 |
| 0.6054299999999951 | -39.416 |
| 0.6057399999999952 | -39.371 |
| 0.6060499999999952 | -39.325 |
| 0.6063599999999952 | -39.277 |
| 0.6066699999999953 | -39.227 |
| 0.6069799999999953 | -39.177 |
| 0.6072899999999953 | -39.124 |
| 0.6075999999999954 | -39.07 |
| 0.6079099999999954 | -39.015 |
| 0.6082199999999954 | -38.958 |
| 0.6085299999999955 | -38.9 |
| 0.6088399999999955 | -38.84 |
| 0.6091499999999955 | -38.779 |
| 0.6094599999999956 | -38.716 |
| 0.6097699999999956 | -38.652 |
| 0.6100799999999956 | -38.587 |
| 0.6103899999999957 | -38.52 |
| 0.6106999999999957 | -38.451 |
| 0.6110099999999957 | -38.381 |
| 0.6113199999999958 | -38.31 |
| 0.6116299999999958 | -38.237 |
| 0.6119399999999958 | -38.162 |
| 0.6122499999999959 | -38.086 |
| 0.6125599999999959 | -38.009 |
| 0.6128699999999959 | -37.931 |
| 0.613179999999996 | -37.85 |
| 0.613489999999996 | -37.769 |
| 0.613799999999996 | -37.686 |
| 0.614109999999996 | -37.601 |
| 0.6144199999999961 | -37.516 |
| 0.6147299999999961 | -37.428 |
| 0.6150399999999961 | -37.34 |
| 0.6153499999999962 | -37.25 |
| 0.6156599999999962 | -37.158 |
| 0.6159699999999962 | -37.065 |
| 0.6162799999999963 | -36.971 |
| 0.6165899999999963 | -36.876 |
| 0.6168999999999963 | -36.779 |
| 0.6172099999999964 | -36.68 |
| 0.6175199999999964 | -36.58 |
| 0.6178299999999964 | -36.479 |
| 0.6181399999999965 | -36.377 |
| 0.6184499999999965 | -36.273 |
| 0.6187599999999965 | -36.168 |
| 0.6190699999999966 | -36.061 |
| 0.6193799999999966 | -35.953 |
| 0.6196899999999966 | -35.844 |
| 0.6199999999999967 | -35.733 |
| 0.6203099999999967 | -35.621 |
| 0.6206199999999967 | -35.508 |
| 0.6209299999999968 | -35.393 |
| 0.6212399999999968 | -35.277 |
| 0.6215499999999968 | -35.16 |
| 0.6218599999999969 | -35.041 |
| 0.6221699999999969 | -34.921 |
| 0.6224799999999969 | -34.8 |
| 0.622789999999997 | -34.677 |
| 0.623099999999997 | -34.553 |
| 0.623409999999997 | -34.428 |
| 0.623719999999997 | -34.302 |
| 0.6240299999999971 | -34.174 |
| 0.6243399999999971 | -34.045 |
| 0.6246499999999972 | -33.915 |
| 0.6249599999999972 | -33.784 |
| 0.6252699999999972 | -33.651 |
| 0.6255799999999972 | -33.517 |
| 0.6258899999999973 | -33.382 |
| 0.6261999999999973 | -33.245 |
| 0.6265099999999973 | -33.107 |
| 0.6268199999999974 | -32.968 |
| 0.6271299999999974 | -32.828 |
| 0.6274399999999974 | -32.687 |
| 0.6277499999999975 | -32.544 |
| 0.6280599999999975 | -32.4 |
| 0.6283699999999975 | -32.255 |
| 0.6286799999999976 | -32.109 |
| 0.6289899999999976 | -31.962 |
| 0.6292999999999976 | -31.813 |
| 0.6296099999999977 | -31.663 |
| 0.6299199999999977 | -31.512 |
| 0.6302299999999977 | -31.36 |
| 0.6305399999999978 | -31.207 |
| 0.6308499999999978 | -31.053 |
| 0.6311599999999978 | -30.897 |
| 0.6314699999999979 | -30.74 |
| 0.6317799999999979 | -30.583 |
| 0.6320899999999979 | -30.424 |
| 0.632399999999998 | -30.264 |
| 0.632709999999998 | -30.102 |
| 0.633019999999998 | -29.94 |
| 0.6333299999999981 | -29.777 |
| 0.6336399999999981 | -29.612 |
| 0.6339499999999981 | -29.447 |
| 0.6342599999999982 | -29.28 |
| 0.6345699999999982 | -29.112 |
| 0.6348799999999982 | -28.943 |
| 0.6351899999999983 | -28.774 |
| 0.6354999999999983 | -28.603 |
| 0.6358099999999983 | -28.431 |
| 0.6361199999999984 | -28.258 |
| 0.6364299999999984 | -28.084 |
| 0.6367399999999984 | -27.909 |
| 0.6370499999999985 | -27.733 |
| 0.6373599999999985 | -27.556 |
| 0.6376699999999985 | -27.377 |
| 0.6379799999999985 | -27.198 |
| 0.6382899999999986 | -27.018 |
| 0.6385999999999986 | -26.837 |
| 0.6389099999999986 | -26.655 |
| 0.6392199999999987 | -26.472 |
| 0.6395299999999987 | -26.288 |
| 0.6398399999999987 | -26.103 |
| 0.6401499999999988 | -25.917 |
| 0.6404599999999988 | -25.731 |
| 0.6407699999999988 | -25.543 |
| 0.6410799999999989 | -25.354 |
| 0.6413899999999989 | -25.165 |
| 0.6416999999999989 | -24.974 |
| 0.642009999999999 | -24.783 |
| 0.642319999999999 | -24.591 |
| 0.642629999999999 | -24.397 |
| 0.6429399999999991 | -24.203 |
| 0.6432499999999991 | -24.009 |
| 0.6435599999999991 | -23.813 |
| 0.6438699999999992 | -23.616 |
| 0.6441799999999992 | -23.419 |
| 0.6444899999999992 | -23.22 |
| 0.6447999999999993 | -23.021 |
| 0.6451099999999993 | -22.821 |
| 0.6454199999999993 | -22.62 |
| 0.6457299999999994 | -22.419 |
| 0.6460399999999994 | -22.217 |
| 0.6463499999999994 | -22.013 |
| 0.6466599999999995 | -21.809 |
| 0.6469699999999995 | -21.605 |
| 0.6472799999999995 | -21.399 |
| 0.6475899999999996 | -21.193 |
| 0.6478999999999996 | -20.986 |
| 0.6482099999999996 | -20.778 |
| 0.6485199999999997 | -20.57 |
| 0.6488299999999997 | -20.36 |
| 0.6491399999999997 | -20.151 |
| 0.6494499999999997 | -19.94 |
| 0.6497599999999998 | -19.729 |
| 0.6500699999999998 | -19.517 |
| 0.6503799999999998 | -19.304 |
| 0.6506899999999999 | -19.09 |
| 0.6509999999999999 | -18.876 |
| 0.65131 | -18.662 |
| 0.65162 | -18.446 |
| 0.65193 | -18.23 |
| 0.65224 | -18.014 |
| 0.6525500000000001 | -17.796 |
| 0.6528600000000001 | -17.578 |
| 0.6531700000000001 | -17.36 |
| 0.6534800000000002 | -17.141 |
| 0.6537900000000002 | -16.921 |
| 0.6541000000000002 | -16.701 |
| 0.6544100000000003 | -16.48 |
| 0.6547200000000003 | -16.259 |
| 0.6550300000000003 | -16.037 |
| 0.6553400000000004 | -15.814 |
| 0.6556500000000004 | -15.591 |
| 0.6559600000000004 | -15.368 |
| 0.6562700000000005 | -15.144 |
| 0.6565800000000005 | -14.919 |
| 0.6568900000000005 | -14.694 |
| 0.6572000000000006 | -14.468 |
| 0.6575100000000006 | -14.242 |
| 0.6578200000000006 | -14.016 |
| 0.6581300000000007 | -13.788 |
| 0.6584400000000007 | -13.561 |
| 0.6587500000000007 | -13.333 |
| 0.6590600000000008 | -13.105 |
| 0.6593700000000008 | -12.876 |
| 0.6596800000000008 | -12.647 |
| 0.6599900000000009 | -12.417 |
| 0.6603000000000009 | -12.187 |
| 0.6606100000000009 | -11.956 |
| 0.660920000000001 | -11.725 |
| 0.661230000000001 | -11.494 |
| 0.661540000000001 | -11.263 |
| 0.661850000000001 | -11.031 |
| 0.6621600000000011 | -10.798 |
| 0.6624700000000011 | -10.566 |
| 0.6627800000000011 | -10.333 |
| 0.6630900000000012 | -10.099 |
| 0.6634000000000012 | -9.866 |
| 0.6637100000000012 | -9.632 |
| 0.6640200000000013 | -9.398 |
| 0.6643300000000013 | -9.163 |
| 0.6646400000000013 | -8.928 |
| 0.6649500000000014 | -8.693 |
| 0.6652600000000014 | -8.458 |
| 0.6655700000000014 | -8.222 |
| 0.6658800000000015 | -7.986 |
| 0.6661900000000015 | -7.75 |
| 0.6665000000000015 | -7.514 |
| 0.6668100000000016 | -7.277 |
| 0.6671200000000016 | -7.041 |
| 0.6674300000000016 | -6.804 |
| 0.6677400000000017 | -6.567 |
| 0.6680500000000017 | -6.329 |
| 0.6683600000000017 | -6.092 |
| 0.6686700000000018 | -5.854 |
| 0.6689800000000018 | -5.617 |
| 0.6692900000000018 | -5.379 |
| 0.6696000000000019 | -5.141 |
| 0.6699100000000019 | -4.903 |
| 0.6702200000000019 | -4.664 |
| 0.670530000000002 | -4.426 |
| 0.670840000000002 | -4.187 |
| 0.671150000000002 | -3.949 |
| 0.671460000000002 | -3.71 |
| 0.6717700000000021 | -3.471 |
| 0.6720800000000021 | -3.233 |
| 0.6723900000000022 | -2.994 |
| 0.6727000000000022 | -2.755 |
| 0.6730100000000022 | -2.516 |
| 0.6733200000000023 | -2.277 |
| 0.6736300000000023 | -2.038 |
| 0.6739400000000023 | -1.799 |
| 0.6742500000000023 | -1.56 |
| 0.6745600000000024 | -1.322 |
| 0.6748700000000024 | -1.083 |
| 0.6751800000000024 | -0.844 |
| 0.6754900000000025 | -0.605 |
| 0.6758000000000025 | -0.366 |
| 0.6761100000000025 | -0.127 |
| 0.6764200000000026 | 0.111 |
| 0.6767300000000026 | 0.35 |
| 0.6770400000000026 | 0.588 |
| 0.6773500000000027 | 0.827 |
| 0.6776600000000027 | 1.065 |
| 0.6779700000000027 | 1.303 |
| 0.6782800000000028 | 1.541 |
| 0.6785900000000028 | 1.779 |
| 0.6789000000000028 | 2.017 |
| 0.6792100000000029 | 2.254 |
| 0.6795200000000029 | 2.492 |